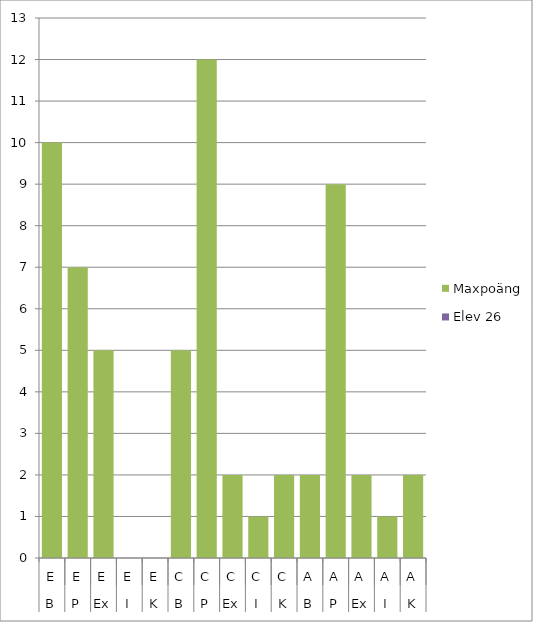
| Category | Maxpoäng | Elev 26 |
|---|---|---|
| 0 | 10 | 0 |
| 1 | 7 | 0 |
| 2 | 5 | 0 |
| 3 | 0 | 0 |
| 4 | 0 | 0 |
| 5 | 5 | 0 |
| 6 | 12 | 0 |
| 7 | 2 | 0 |
| 8 | 1 | 0 |
| 9 | 2 | 0 |
| 10 | 2 | 0 |
| 11 | 9 | 0 |
| 12 | 2 | 0 |
| 13 | 1 | 0 |
| 14 | 2 | 0 |